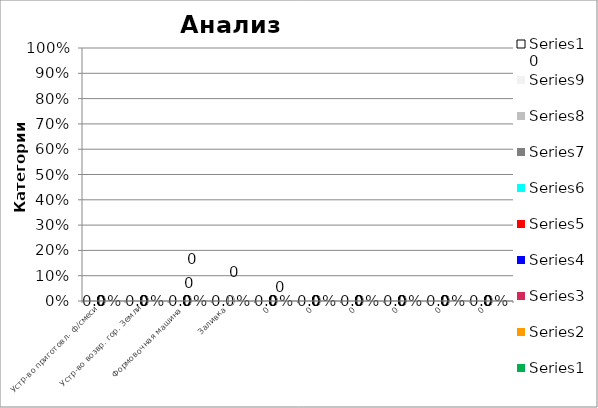
| Category | Series 2 | Series 3 | Series 4 | Series 5 | Series 6 | Series 7 | Series 8 | Series 9 | Series 10 | Series 11 |
|---|---|---|---|---|---|---|---|---|---|---|
| 0 | 0 | 0 | 0 | 0 | 0 | 0 | 0 | 0 | 0 | 0 |
| 1 | 0 | 0 | 0 | 0 | 0 | 0 | 0 | 0 | 0 | 0 |
| 2 | 0 | 0 | 0 | 0 | 0 | 0 | 0 | 0 | 0 | 0 |
| 3 | 0 | 0 | 0 | 0 | 0 | 0 | 0 | 0 | 0 | 0 |
| 4 | 0 | 0 | 0 | 0 | 0 | 0 | 0 | 0 | 0 | 0 |
| 5 | 0 | 0 | 0 | 0 | 0 | 0 | 0 | 0 | 0 | 0 |
| 6 | 0 | 0 | 0 | 0 | 0 | 0 | 0 | 0 | 0 | 0 |
| 7 | 0 | 0 | 0 | 0 | 0 | 0 | 0 | 0 | 0 | 0 |
| 8 | 0 | 0 | 0 | 0 | 0 | 0 | 0 | 0 | 0 | 0 |
| 9 | 0 | 0 | 0 | 0 | 0 | 0 | 0 | 0 | 0 | 0 |